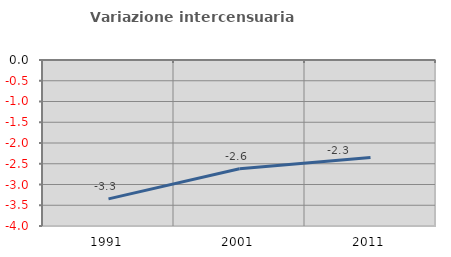
| Category | Variazione intercensuaria annua |
|---|---|
| 1991.0 | -3.346 |
| 2001.0 | -2.619 |
| 2011.0 | -2.348 |